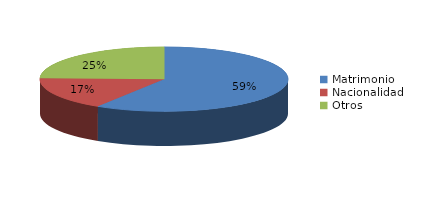
| Category | Series 0 |
|---|---|
| Matrimonio | 1974 |
| Nacionalidad | 554 |
| Otros | 821 |